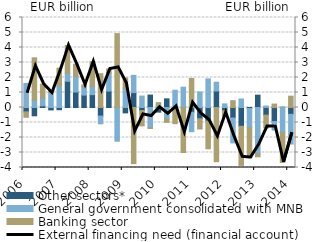
| Category | Other sectors* | General government consolidated with MNB | Banking sector |
|---|---|---|---|
| 2006.0 | -0.291 | 1.604 | -0.362 |
| 2006.0 | -0.552 | 0.481 | 2.832 |
| 2006.0 | 0.113 | 0.502 | 0.935 |
| 2006.0 | -0.162 | 1.015 | 0.116 |
| 2007.0 | -0.146 | 1.432 | 1.186 |
| 2007.0 | 1.75 | 0.531 | 1.855 |
| 2007.0 | 1.032 | 1.043 | 0.809 |
| 2007.0 | 0.826 | 0.56 | 0.123 |
| 2008.0 | 0.858 | 0.55 | 1.65 |
| 2008.0 | -0.573 | -0.515 | 2.253 |
| 2008.0 | 1.09 | 1.204 | 0.272 |
| 2008.0 | -0.005 | -2.243 | 4.923 |
| 2009.0 | -0.359 | 1.252 | 0.715 |
| 2009.0 | 0.992 | 1.153 | -3.741 |
| 2009.0 | -0.203 | 0.763 | -1.021 |
| 2009.0 | 0.829 | -1.346 | -0.051 |
| 2010.0 | -0.309 | 0.162 | 0.163 |
| 2010.0 | 0.575 | -0.775 | -0.218 |
| 2010.0 | -0.092 | 1.151 | -0.986 |
| 2010.0 | 0.006 | 1.348 | -3.002 |
| 2011.0 | -0.317 | -1.299 | 1.938 |
| 2011.0 | -0.749 | 1.038 | -0.685 |
| 2011.0 | -0.908 | 1.908 | -1.842 |
| 2011.0 | 1.099 | 0.588 | -3.612 |
| 2012.0 | -0.214 | 0.242 | -0.367 |
| 2012.0 | -0.702 | -1.659 | 0.455 |
| 2012.0 | -1.252 | 0.569 | -2.606 |
| 2012.0 | -0.065 | -1.283 | -1.99 |
| 2013.0 | 0.822 | -3.087 | -0.2 |
| 2013.0 | -0.508 | 0.099 | -0.853 |
| 2013.0 | -0.939 | -0.568 | 0.229 |
| 2013.0 | 0.022 | -1.65 | -2.016 |
| 2014.0 | -0.454 | -1.984 | 0.756 |